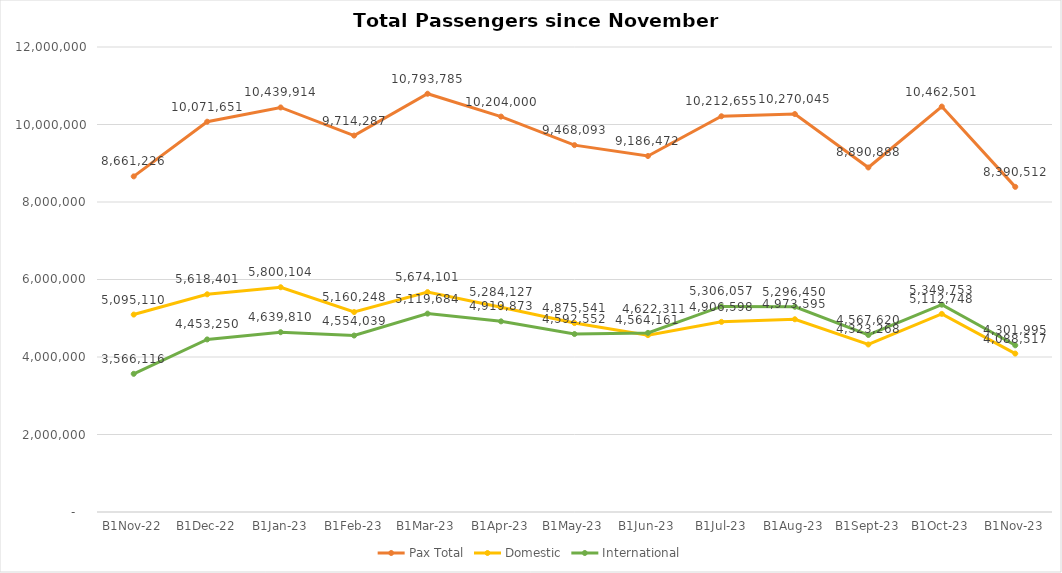
| Category | Pax Total | Domestic | International |
|---|---|---|---|
| 2022-11-01 | 8661226 | 5095110 | 3566116 |
| 2022-12-01 | 10071651 | 5618401 | 4453250 |
| 2023-01-01 | 10439914 | 5800104 | 4639810 |
| 2023-02-01 | 9714287 | 5160248 | 4554039 |
| 2023-03-01 | 10793785 | 5674101 | 5119684 |
| 2023-04-01 | 10204000 | 5284127 | 4919873 |
| 2023-05-01 | 9468093 | 4875541 | 4592552 |
| 2023-06-01 | 9186472 | 4564161 | 4622311 |
| 2023-07-01 | 10212655 | 4906598 | 5306057 |
| 2023-08-01 | 10270045 | 4973595 | 5296450 |
| 2023-09-01 | 8890888 | 4323268 | 4567620 |
| 2023-10-01 | 10462501 | 5112748 | 5349753 |
| 2023-11-01 | 8390512 | 4088517 | 4301995 |